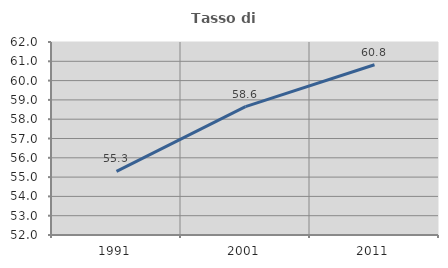
| Category | Tasso di occupazione   |
|---|---|
| 1991.0 | 55.297 |
| 2001.0 | 58.649 |
| 2011.0 | 60.823 |